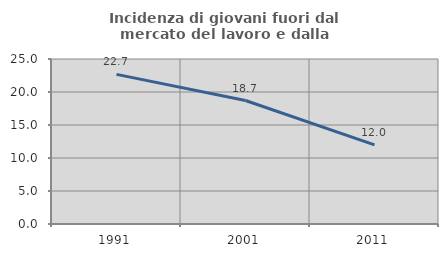
| Category | Incidenza di giovani fuori dal mercato del lavoro e dalla formazione  |
|---|---|
| 1991.0 | 22.672 |
| 2001.0 | 18.71 |
| 2011.0 | 12 |